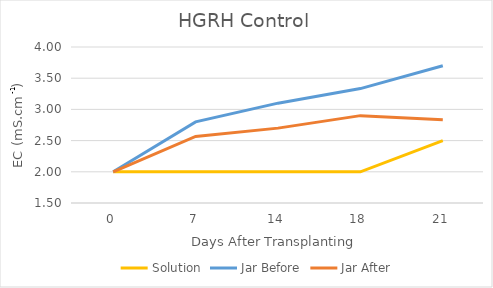
| Category | Solution | Jar Before | Jar After |
|---|---|---|---|
| 0.0 | 2 | 2 | 2 |
| 7.0 | 2 | 2.8 | 2.567 |
| 14.0 | 2 | 3.1 | 2.7 |
| 18.0 | 2 | 3.333 | 2.9 |
| 21.0 | 2.5 | 3.7 | 2.833 |